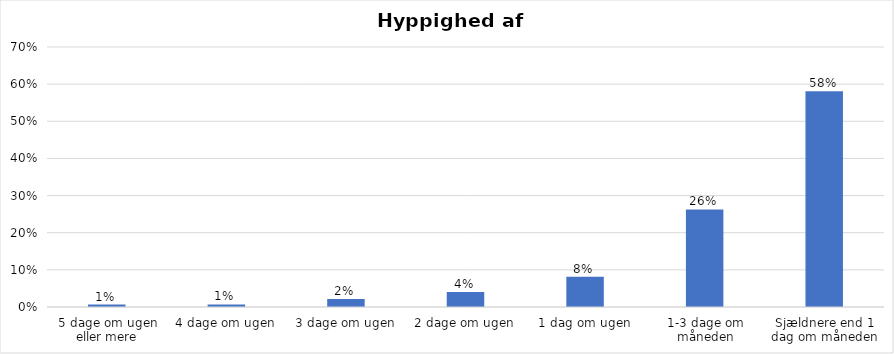
| Category | % |
|---|---|
| 5 dage om ugen eller mere | 0.007 |
| 4 dage om ugen | 0.007 |
| 3 dage om ugen | 0.021 |
| 2 dage om ugen | 0.04 |
| 1 dag om ugen | 0.081 |
| 1-3 dage om måneden | 0.263 |
| Sjældnere end 1 dag om måneden | 0.581 |